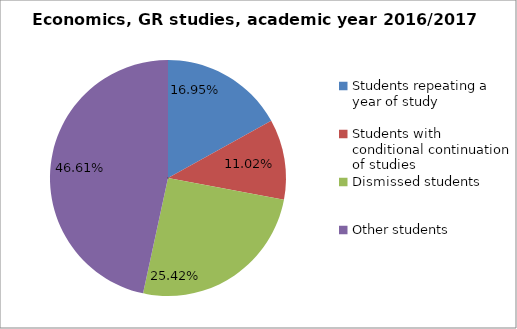
| Category | Series 0 |
|---|---|
| Students repeating a year of study | 20 |
| Students with conditional continuation of studies | 13 |
| Dismissed students | 30 |
| Other students | 55 |